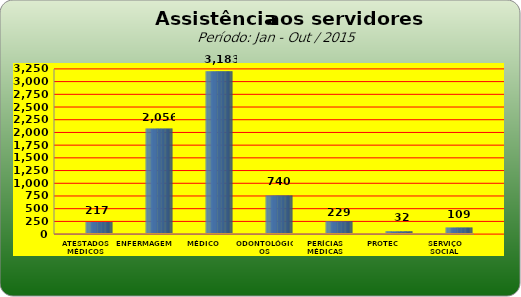
| Category | Series 0 |
|---|---|
| ATESTADOS MÉDICOS | 217 |
| ENFERMAGEM | 2056 |
| MÉDICO | 3183 |
| ODONTOLÓGICOS | 740 |
| PERÍCIAS MÉDICAS | 229 |
| PROTEC | 32 |
| SERVIÇO SOCIAL | 109 |